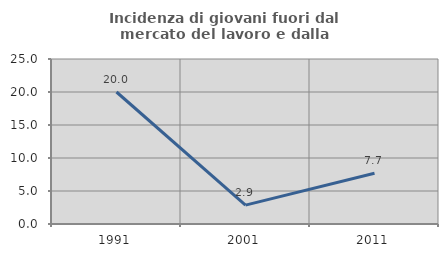
| Category | Incidenza di giovani fuori dal mercato del lavoro e dalla formazione  |
|---|---|
| 1991.0 | 20 |
| 2001.0 | 2.857 |
| 2011.0 | 7.692 |